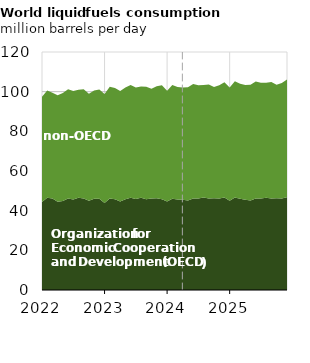
| Category | OECD | non-OECD |
|---|---|---|
| 2022-01-01 | 44.409 | 52.99 |
| 2022-02-01 | 46.563 | 54.058 |
| 2022-03-01 | 46.112 | 53.307 |
| 2022-04-01 | 44.503 | 53.641 |
| 2022-05-01 | 44.911 | 54.475 |
| 2022-06-01 | 46.095 | 55.085 |
| 2022-07-01 | 45.679 | 54.712 |
| 2022-08-01 | 46.539 | 54.453 |
| 2022-09-01 | 46.125 | 55.113 |
| 2022-10-01 | 44.966 | 53.987 |
| 2022-11-01 | 45.992 | 54.546 |
| 2022-12-01 | 45.973 | 55.165 |
| 2023-01-01 | 43.848 | 54.925 |
| 2023-02-01 | 46.079 | 56.409 |
| 2023-03-01 | 45.807 | 55.981 |
| 2023-04-01 | 44.663 | 55.649 |
| 2023-05-01 | 45.811 | 56.304 |
| 2023-06-01 | 46.562 | 56.861 |
| 2023-07-01 | 45.892 | 56.21 |
| 2023-08-01 | 46.508 | 56.133 |
| 2023-09-01 | 45.713 | 56.792 |
| 2023-10-01 | 46.185 | 55.296 |
| 2023-11-01 | 46.254 | 56.516 |
| 2023-12-01 | 45.799 | 57.459 |
| 2024-01-01 | 44.584 | 55.938 |
| 2024-02-01 | 46.054 | 57.34 |
| 2024-03-01 | 45.686 | 56.651 |
| 2024-04-01 | 45.559 | 56.6 |
| 2024-05-01 | 45.164 | 57.051 |
| 2024-06-01 | 46.087 | 57.736 |
| 2024-07-01 | 46.152 | 57.089 |
| 2024-08-01 | 46.638 | 56.721 |
| 2024-09-01 | 46.098 | 57.466 |
| 2024-10-01 | 46.298 | 56.023 |
| 2024-11-01 | 46.166 | 57.068 |
| 2024-12-01 | 46.687 | 58.089 |
| 2025-01-01 | 44.989 | 57.162 |
| 2025-02-01 | 46.66 | 58.601 |
| 2025-03-01 | 46.062 | 57.903 |
| 2025-04-01 | 45.452 | 57.858 |
| 2025-05-01 | 45.125 | 58.332 |
| 2025-06-01 | 46.126 | 59.035 |
| 2025-07-01 | 46.169 | 58.363 |
| 2025-08-01 | 46.494 | 57.983 |
| 2025-09-01 | 46.118 | 58.743 |
| 2025-10-01 | 46.259 | 57.269 |
| 2025-11-01 | 46.093 | 58.326 |
| 2025-12-01 | 46.762 | 59.37 |